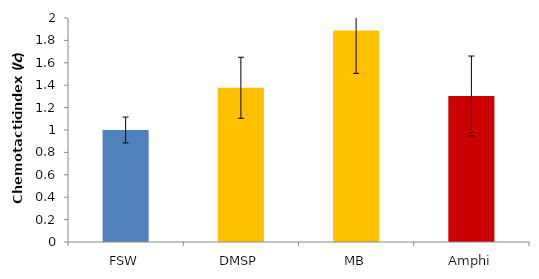
| Category | Series 0 |
|---|---|
| FSW | 1 |
| DMSP | 1.377 |
| MB | 1.887 |
| Amphi | 1.304 |